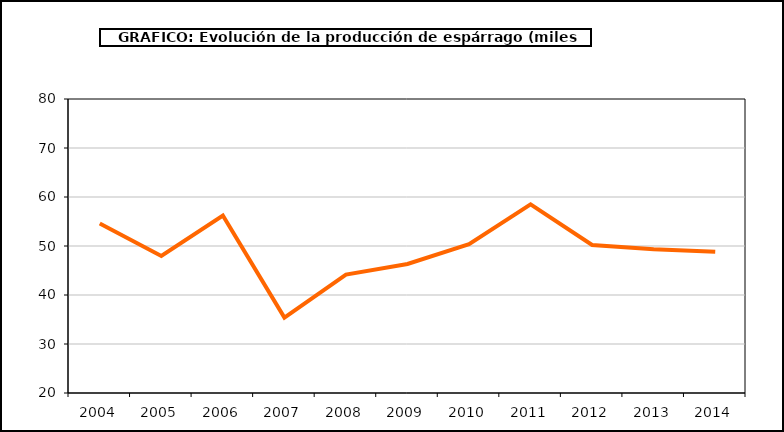
| Category | producción |
|---|---|
| 2004.0 | 54.577 |
| 2005.0 | 47.963 |
| 2006.0 | 56.21 |
| 2007.0 | 35.396 |
| 2008.0 | 44.169 |
| 2009.0 | 46.324 |
| 2010.0 | 50.362 |
| 2011.0 | 58.496 |
| 2012.0 | 50.212 |
| 2013.0 | 49.352 |
| 2014.0 | 48.814 |